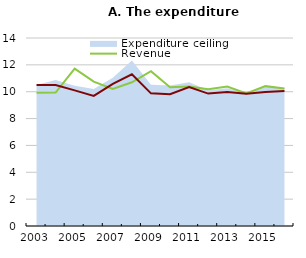
| Category | Revenue | Expenditure |
|---|---|---|
| 2003.0 | 9.916 | 10.505 |
| 2004.0 | 9.933 | 10.5 |
| 2005.0 | 11.724 | 10.1 |
| 2006.0 | 10.752 | 9.69 |
| 2007.0 | 10.209 | 10.584 |
| 2008.0 | 10.7 | 11.294 |
| 2009.0 | 11.532 | 9.879 |
| 2010.0 | 10.33 | 9.814 |
| 2011.0 | 10.386 | 10.353 |
| 2012.0 | 10.178 | 9.859 |
| 2013.0 | 10.392 | 9.979 |
| 2014.0 | 9.863 | 9.849 |
| 2015.0 | 10.415 | 9.982 |
| 2016.0 | 10.239 | 10.052 |